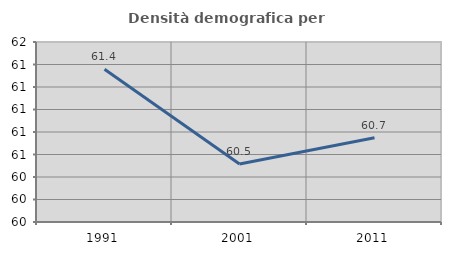
| Category | Densità demografica |
|---|---|
| 1991.0 | 61.359 |
| 2001.0 | 60.516 |
| 2011.0 | 60.75 |